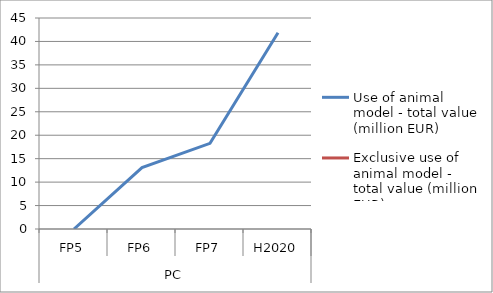
| Category | Use of animal model - total value (million EUR)   | Exclusive use of animal model - total value (million EUR) |
|---|---|---|
| 0 | 0 | 0 |
| 1 | 13.077 | 0 |
| 2 | 18.258 | 0 |
| 3 | 41.871 | 0 |